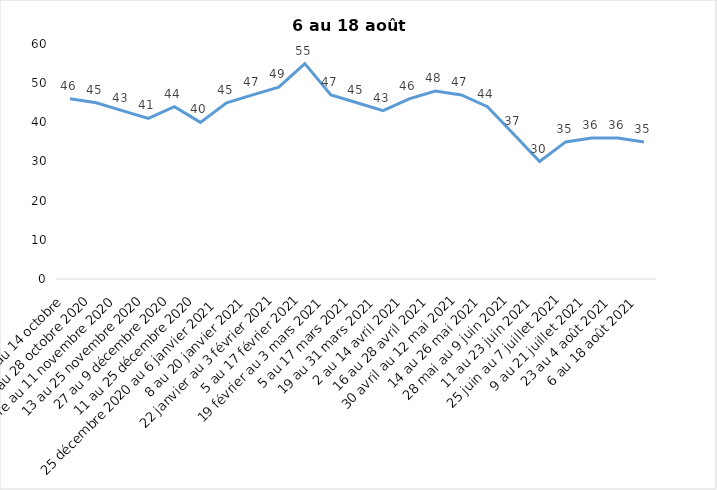
| Category | Toujours aux trois mesures |
|---|---|
| 2 au 14 octobre  | 46 |
| 16 au 28 octobre 2020 | 45 |
| 30 octobre au 11 novembre 2020 | 43 |
| 13 au 25 novembre 2020 | 41 |
| 27 au 9 décembre 2020 | 44 |
| 11 au 25 décembre 2020 | 40 |
| 25 décembre 2020 au 6 janvier 2021 | 45 |
| 8 au 20 janvier 2021 | 47 |
| 22 janvier au 3 février 2021 | 49 |
| 5 au 17 février 2021 | 55 |
| 19 février au 3 mars 2021 | 47 |
| 5 au 17 mars 2021 | 45 |
| 19 au 31 mars 2021 | 43 |
| 2 au 14 avril 2021 | 46 |
| 16 au 28 avril 2021 | 48 |
| 30 avril au 12 mai 2021 | 47 |
| 14 au 26 mai 2021 | 44 |
| 28 mai au 9 juin 2021 | 37 |
| 11 au 23 juin 2021 | 30 |
| 25 juin au 7 juillet 2021 | 35 |
| 9 au 21 juillet 2021 | 36 |
| 23 au 4 août 2021 | 36 |
| 6 au 18 août 2021 | 35 |